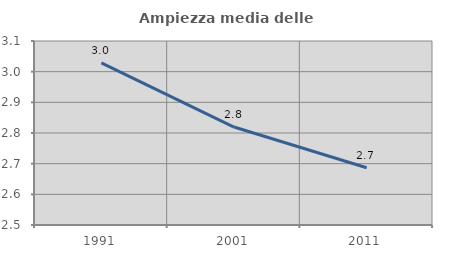
| Category | Ampiezza media delle famiglie |
|---|---|
| 1991.0 | 3.029 |
| 2001.0 | 2.819 |
| 2011.0 | 2.687 |